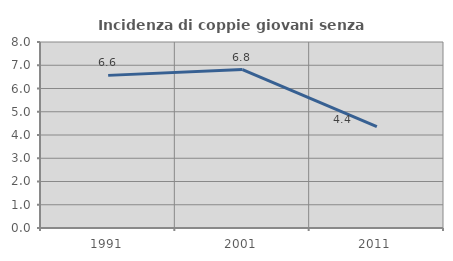
| Category | Incidenza di coppie giovani senza figli |
|---|---|
| 1991.0 | 6.565 |
| 2001.0 | 6.817 |
| 2011.0 | 4.359 |